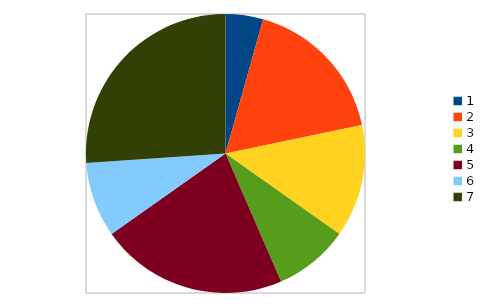
| Category | excel |
|---|---|
| 0 | 200 |
| 1 | 800 |
| 2 | 600 |
| 3 | 400 |
| 4 | 1000 |
| 5 | 400 |
| 6 | 1200 |